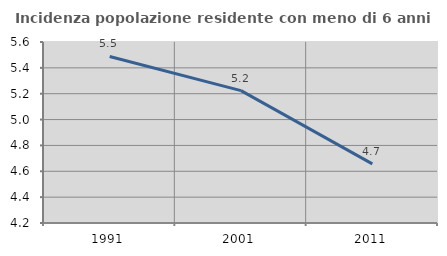
| Category | Incidenza popolazione residente con meno di 6 anni |
|---|---|
| 1991.0 | 5.488 |
| 2001.0 | 5.224 |
| 2011.0 | 4.657 |